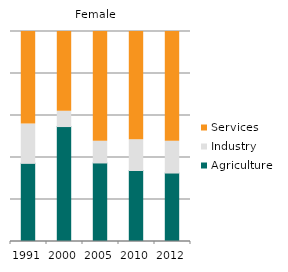
| Category | Agriculture | Industry | Services |
|---|---|---|---|
| 1991.0 | 37.209 | 18.706 | 44.084 |
| 2000.0 | 54.731 | 7.307 | 37.962 |
| 2005.0 | 37.4 | 10.312 | 52.288 |
| 2010.0 | 33.806 | 14.632 | 51.562 |
| 2012.0 | 32.606 | 15.185 | 52.209 |